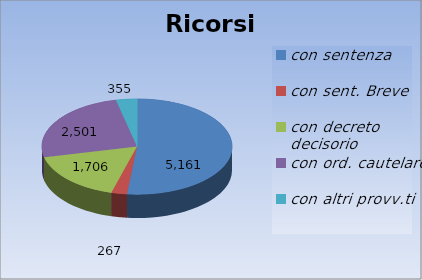
| Category | Ricorsi definiti |
|---|---|
| con sentenza | 5161 |
| con sent. Breve | 267 |
| con decreto decisorio | 1706 |
| con ord. cautelare | 2501 |
| con altri provv.ti | 355 |